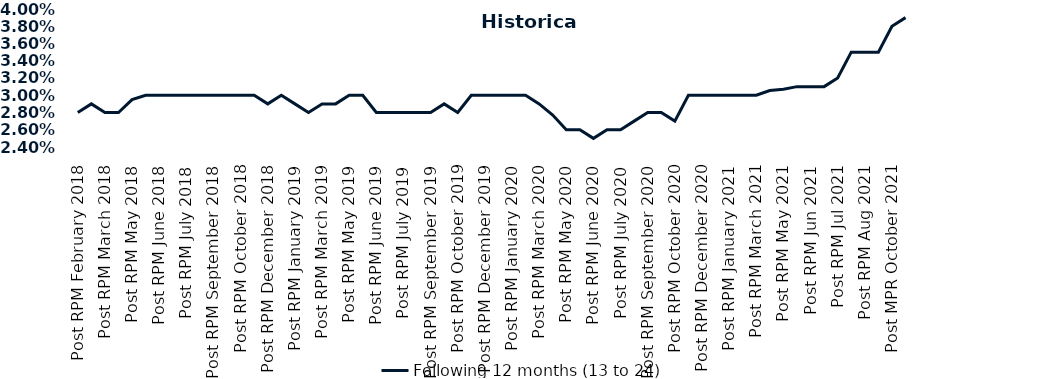
| Category | Following 12 months (13 to 24)  |
|---|---|
| Post RPM February 2018 | 0.028 |
| Pre RPM March 2018 | 0.029 |
| Post RPM March 2018 | 0.028 |
| Pre RPM May 2018 | 0.028 |
| Post RPM May 2018 | 0.03 |
| Pre RPM June 2018 | 0.03 |
| Post RPM June 2018 | 0.03 |
| Pre RPM July 2018 | 0.03 |
| Post RPM July 2018 | 0.03 |
| Pre RPM September 2018 | 0.03 |
| Post RPM September 2018 | 0.03 |
| Pre RPM October 2018 | 0.03 |
| Post RPM October 2018 | 0.03 |
| Pre RPM December 2018 | 0.03 |
| Post RPM December 2018 | 0.029 |
| Pre RPM January 2019 | 0.03 |
| Post RPM January 2019 | 0.029 |
| Pre RPM March 2019 | 0.028 |
| Post RPM March 2019 | 0.029 |
| Pre RPM May 2019 | 0.029 |
| Post RPM May 2019 | 0.03 |
| Pre RPM June 2019 | 0.03 |
| Post RPM June 2019 | 0.028 |
| Pre RPM July 2019 | 0.028 |
| Post RPM July 2019 | 0.028 |
| Pre RPM September 2019 | 0.028 |
| Post RPM September 2019 | 0.028 |
| Pre RPM October 2019 | 0.029 |
| Post RPM October 2019 | 0.028 |
| Pre RPM December 2019 | 0.03 |
| Post RPM December 2019 | 0.03 |
| Pre RPM January 2020 | 0.03 |
| Post RPM January 2020 | 0.03 |
| Pre RPM March 2020 | 0.03 |
| Post RPM March 2020 | 0.029 |
| Pre RPM May 2020 | 0.028 |
| Post RPM May 2020 | 0.026 |
| Pre RPM June 2020 | 0.026 |
| Post RPM June 2020 | 0.025 |
| Pre RPM July 2020 | 0.026 |
| Post RPM July 2020 | 0.026 |
| Pre RPM September 2020 | 0.027 |
| Post RPM September 2020 | 0.028 |
| Pre RPM October 2020 | 0.028 |
| Post RPM October 2020 | 0.027 |
| Pre RPM December 2020 | 0.03 |
|  Post RPM December 2020 | 0.03 |
| Pre RPM January 2021 | 0.03 |
| Post RPM January 2021 | 0.03 |
|  Pre RPM March 2021 | 0.03 |
|  Post RPM March 2021 | 0.03 |
|  Pre RPM May 2021 | 0.031 |
|  Post RPM May 2021 | 0.031 |
|  Pre RPM Jun 2021 | 0.031 |
|   Post RPM Jun 2021 | 0.031 |
| Pre RPM Jul 2021 | 0.031 |
|  Post RPM Jul 2021 | 0.032 |
| Pre RPM Aug 2021 | 0.035 |
|  Post RPM Aug 2021 | 0.035 |
| Pre MPR October 2021 | 0.035 |
| Post MPR October 2021 | 0.038 |
| Pre MPR December 2021 | 0.039 |